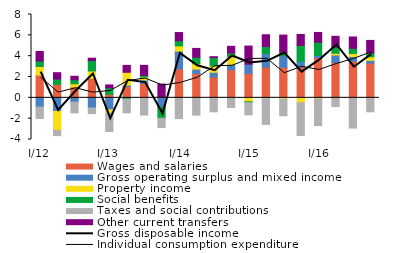
| Category | Wages and salaries | Gross operating surplus and mixed income  | Property income | Social benefits  | Taxes and social contributions | Other current transfers |
|---|---|---|---|---|---|---|
| I/12 | 2.18 | -0.878 | 0.831 | 0.519 | -1.102 | 0.917 |
| II | 1.291 | -1.297 | -1.821 | 0.51 | -0.51 | 0.612 |
| III | 1.049 | -0.415 | 0.3 | 0.386 | -1.025 | 0.335 |
| IV | 1.879 | -0.977 | 0.698 | 0.994 | -0.534 | 0.233 |
| I/13 | 0.339 | -1.155 | -0.319 | 0.62 | -1.76 | 0.281 |
| II | 1.086 | 0.133 | 1.234 | -0.13 | -1.308 | 0.662 |
| III | 1.383 | 0.336 | 0.283 | 0.152 | -1.658 | 0.965 |
|  IV | 0.034 | -0.874 | 0.048 | -1.095 | -0.887 | 1.24 |
|  I/14 | 2.771 | 1.713 | 0.504 | 0.489 | -1.995 | 0.791 |
| II | 2.338 | 0.418 | 0.516 | 0.619 | -1.661 | 0.853 |
| III | 2.003 | 0.446 | 0.622 | 0.801 | -1.346 | 0.078 |
| IV | 2.689 | 0.515 | 0.744 | 0.361 | -0.929 | 0.639 |
|  I/15 | 2.339 | 0.892 | -0.378 | -0.086 | -1.165 | 1.738 |
| II | 2.94 | 1.309 | -0.032 | 0.681 | -2.52 | 1.126 |
| III | 2.93 | 1.107 | -0.118 | 0.337 | -1.6 | 1.647 |
| IV | 2.961 | 0.535 | -0.467 | 1.54 | -3.15 | 1.043 |
|  I/16 | 3.854 | 0.235 | -0.092 | 1.254 | -2.57 | 0.935 |
| II | 3.396 | 0.715 | 0.172 | 0.572 | -0.83 | 1.05 |
| III | 3.511 | 0.461 | 0.284 | 0.497 | -2.9 | 1.088 |
| IV | 3.334 | 0.258 | 0.344 | 0.379 | -1.34 | 1.198 |